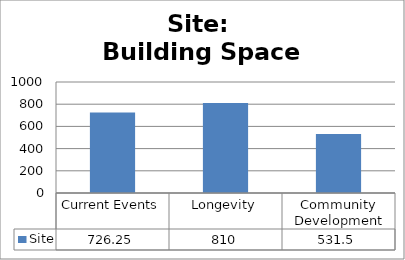
| Category | Site |
|---|---|
| Current Events | 726.25 |
| Longevity | 810 |
| Community Development | 531.5 |